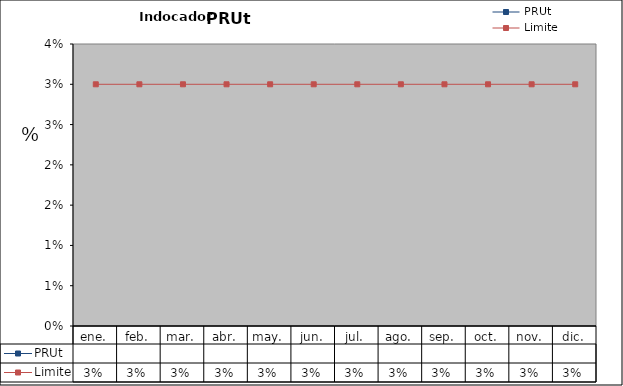
| Category | PRUt | Limite |
|---|---|---|
| ene. |  | 0.03 |
| feb. |  | 0.03 |
| mar. |  | 0.03 |
| abr. |  | 0.03 |
| may. |  | 0.03 |
| jun. |  | 0.03 |
| jul. |  | 0.03 |
| ago. |  | 0.03 |
| sep. |  | 0.03 |
| oct. |  | 0.03 |
| nov. |  | 0.03 |
| dic. |  | 0.03 |